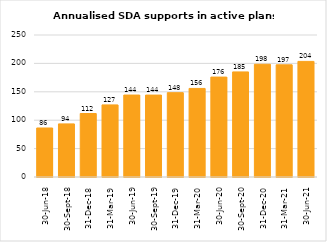
| Category | Annualised SDA supports in active plans ($m) |
|---|---|
| 2018-06-30 | 86288084.088 |
| 2018-09-30 | 93522685.537 |
| 2018-12-31 | 111792542.62 |
| 2019-03-31 | 126930858.6 |
| 2019-06-30 | 144261355.81 |
| 2019-09-30 | 144218179.04 |
| 2019-12-31 | 148438502.385 |
| 2020-03-31 | 155925544.292 |
| 2020-06-30 | 175904859.02 |
| 2020-09-30 | 184997050.06 |
| 2020-12-31 | 198431336.49 |
| 2021-03-31 | 197490443.31 |
| 2021-06-30 | 203521764.563 |